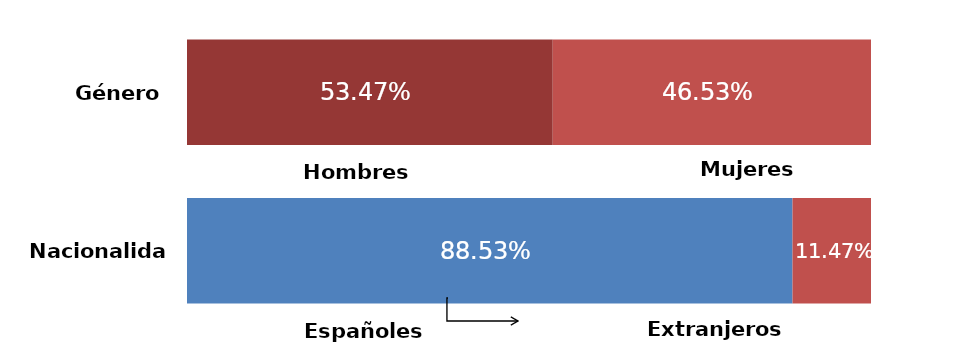
| Category | Series 0 | Series 1 |
|---|---|---|
| 0 | 0.535 | 0.465 |
| 1 | 0.885 | 0.115 |